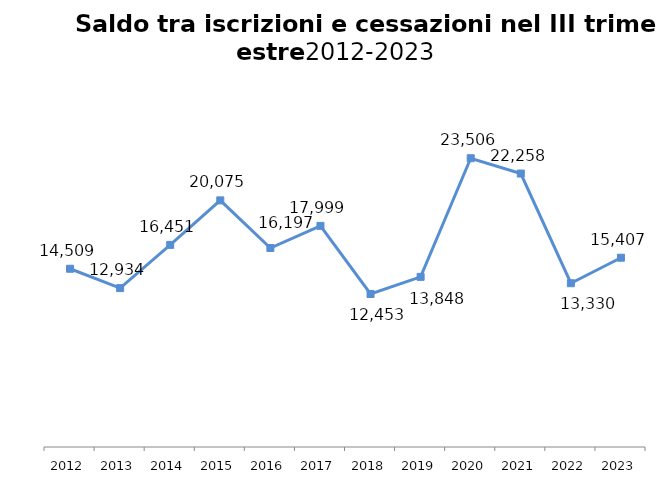
| Category | Saldo trimestrale |
|---|---|
| 2012.0 | 14509 |
| 2013.0 | 12934 |
| 2014.0 | 16451 |
| 2015.0 | 20075 |
| 2016.0 | 16197 |
| 2017.0 | 17999 |
| 2018.0 | 12453 |
| 2019.0 | 13848 |
| 2020.0 | 23506 |
| 2021.0 | 22258 |
| 2022.0 | 13330 |
| 2023.0 | 15407 |